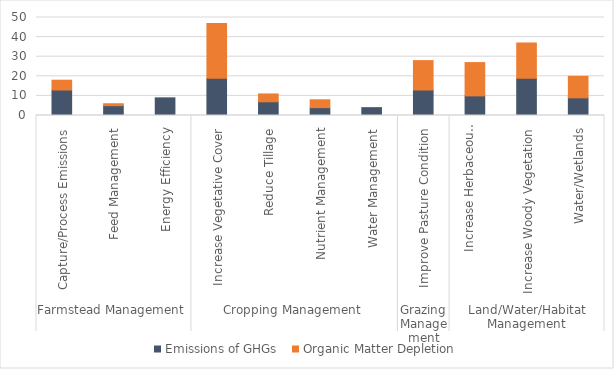
| Category | Emissions of GHGs  | Organic Matter Depletion |
|---|---|---|
| 0 | 13 | 5 |
| 1 | 5 | 1 |
| 2 | 9 | 0 |
| 3 | 19 | 28 |
| 4 | 7 | 4 |
| 5 | 4 | 4 |
| 6 | 4 | -1 |
| 7 | 13 | 15 |
| 8 | 10 | 17 |
| 9 | 19 | 18 |
| 10 | 9 | 11 |